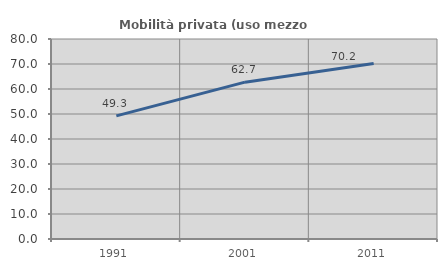
| Category | Mobilità privata (uso mezzo privato) |
|---|---|
| 1991.0 | 49.258 |
| 2001.0 | 62.74 |
| 2011.0 | 70.177 |